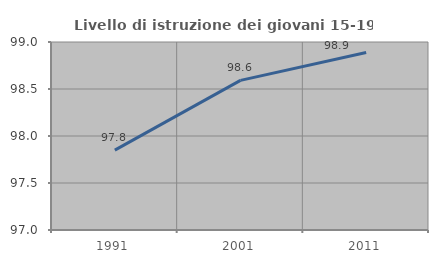
| Category | Livello di istruzione dei giovani 15-19 anni |
|---|---|
| 1991.0 | 97.849 |
| 2001.0 | 98.592 |
| 2011.0 | 98.889 |